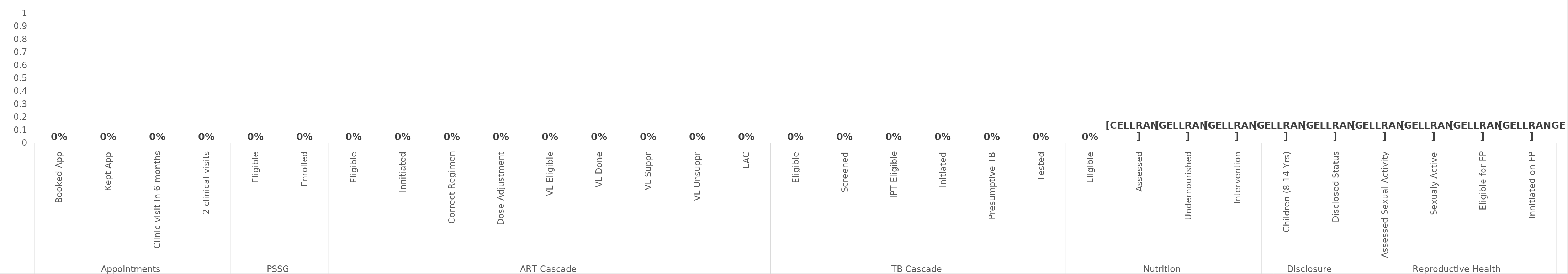
| Category | Total |
|---|---|
| 0 | 0 |
| 1 | 0 |
| 2 | 0 |
| 3 | 0 |
| 4 | 0 |
| 5 | 0 |
| 6 | 0 |
| 7 | 0 |
| 8 | 0 |
| 9 | 0 |
| 10 | 0 |
| 11 | 0 |
| 12 | 0 |
| 13 | 0 |
| 14 | 0 |
| 15 | 0 |
| 16 | 0 |
| 17 | 0 |
| 18 | 0 |
| 19 | 0 |
| 20 | 0 |
| 21 | 0 |
| 22 | 0 |
| 23 | 0 |
| 24 | 0 |
| 25 | 0 |
| 26 | 0 |
| 27 | 0 |
| 28 | 0 |
| 29 | 0 |
| 30 | 0 |